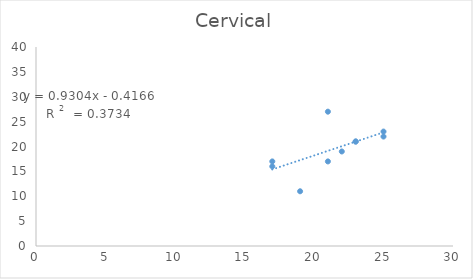
| Category | Cervical |
|---|---|
| 17.0 | 17 |
| 17.0 | 16 |
| 23.0 | 21 |
| 23.0 | 21 |
| 21.0 | 27 |
| 21.0 | 17 |
| 19.0 | 11 |
| 22.0 | 19 |
| 25.0 | 23 |
| 25.0 | 22 |